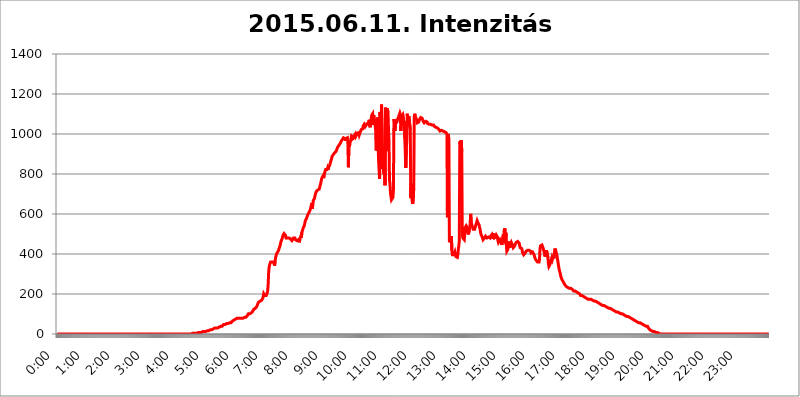
| Category | 2015.06.11. Intenzitás [W/m^2] |
|---|---|
| 0.0 | 0 |
| 0.0006944444444444445 | 0 |
| 0.001388888888888889 | 0 |
| 0.0020833333333333333 | 0 |
| 0.002777777777777778 | 0 |
| 0.003472222222222222 | 0 |
| 0.004166666666666667 | 0 |
| 0.004861111111111111 | 0 |
| 0.005555555555555556 | 0 |
| 0.0062499999999999995 | 0 |
| 0.006944444444444444 | 0 |
| 0.007638888888888889 | 0 |
| 0.008333333333333333 | 0 |
| 0.009027777777777779 | 0 |
| 0.009722222222222222 | 0 |
| 0.010416666666666666 | 0 |
| 0.011111111111111112 | 0 |
| 0.011805555555555555 | 0 |
| 0.012499999999999999 | 0 |
| 0.013194444444444444 | 0 |
| 0.013888888888888888 | 0 |
| 0.014583333333333332 | 0 |
| 0.015277777777777777 | 0 |
| 0.015972222222222224 | 0 |
| 0.016666666666666666 | 0 |
| 0.017361111111111112 | 0 |
| 0.018055555555555557 | 0 |
| 0.01875 | 0 |
| 0.019444444444444445 | 0 |
| 0.02013888888888889 | 0 |
| 0.020833333333333332 | 0 |
| 0.02152777777777778 | 0 |
| 0.022222222222222223 | 0 |
| 0.02291666666666667 | 0 |
| 0.02361111111111111 | 0 |
| 0.024305555555555556 | 0 |
| 0.024999999999999998 | 0 |
| 0.025694444444444447 | 0 |
| 0.02638888888888889 | 0 |
| 0.027083333333333334 | 0 |
| 0.027777777777777776 | 0 |
| 0.02847222222222222 | 0 |
| 0.029166666666666664 | 0 |
| 0.029861111111111113 | 0 |
| 0.030555555555555555 | 0 |
| 0.03125 | 0 |
| 0.03194444444444445 | 0 |
| 0.03263888888888889 | 0 |
| 0.03333333333333333 | 0 |
| 0.034027777777777775 | 0 |
| 0.034722222222222224 | 0 |
| 0.035416666666666666 | 0 |
| 0.036111111111111115 | 0 |
| 0.03680555555555556 | 0 |
| 0.0375 | 0 |
| 0.03819444444444444 | 0 |
| 0.03888888888888889 | 0 |
| 0.03958333333333333 | 0 |
| 0.04027777777777778 | 0 |
| 0.04097222222222222 | 0 |
| 0.041666666666666664 | 0 |
| 0.042361111111111106 | 0 |
| 0.04305555555555556 | 0 |
| 0.043750000000000004 | 0 |
| 0.044444444444444446 | 0 |
| 0.04513888888888889 | 0 |
| 0.04583333333333334 | 0 |
| 0.04652777777777778 | 0 |
| 0.04722222222222222 | 0 |
| 0.04791666666666666 | 0 |
| 0.04861111111111111 | 0 |
| 0.049305555555555554 | 0 |
| 0.049999999999999996 | 0 |
| 0.05069444444444445 | 0 |
| 0.051388888888888894 | 0 |
| 0.052083333333333336 | 0 |
| 0.05277777777777778 | 0 |
| 0.05347222222222222 | 0 |
| 0.05416666666666667 | 0 |
| 0.05486111111111111 | 0 |
| 0.05555555555555555 | 0 |
| 0.05625 | 0 |
| 0.05694444444444444 | 0 |
| 0.057638888888888885 | 0 |
| 0.05833333333333333 | 0 |
| 0.05902777777777778 | 0 |
| 0.059722222222222225 | 0 |
| 0.06041666666666667 | 0 |
| 0.061111111111111116 | 0 |
| 0.06180555555555556 | 0 |
| 0.0625 | 0 |
| 0.06319444444444444 | 0 |
| 0.06388888888888888 | 0 |
| 0.06458333333333334 | 0 |
| 0.06527777777777778 | 0 |
| 0.06597222222222222 | 0 |
| 0.06666666666666667 | 0 |
| 0.06736111111111111 | 0 |
| 0.06805555555555555 | 0 |
| 0.06874999999999999 | 0 |
| 0.06944444444444443 | 0 |
| 0.07013888888888889 | 0 |
| 0.07083333333333333 | 0 |
| 0.07152777777777779 | 0 |
| 0.07222222222222223 | 0 |
| 0.07291666666666667 | 0 |
| 0.07361111111111111 | 0 |
| 0.07430555555555556 | 0 |
| 0.075 | 0 |
| 0.07569444444444444 | 0 |
| 0.0763888888888889 | 0 |
| 0.07708333333333334 | 0 |
| 0.07777777777777778 | 0 |
| 0.07847222222222222 | 0 |
| 0.07916666666666666 | 0 |
| 0.0798611111111111 | 0 |
| 0.08055555555555556 | 0 |
| 0.08125 | 0 |
| 0.08194444444444444 | 0 |
| 0.08263888888888889 | 0 |
| 0.08333333333333333 | 0 |
| 0.08402777777777777 | 0 |
| 0.08472222222222221 | 0 |
| 0.08541666666666665 | 0 |
| 0.08611111111111112 | 0 |
| 0.08680555555555557 | 0 |
| 0.08750000000000001 | 0 |
| 0.08819444444444445 | 0 |
| 0.08888888888888889 | 0 |
| 0.08958333333333333 | 0 |
| 0.09027777777777778 | 0 |
| 0.09097222222222222 | 0 |
| 0.09166666666666667 | 0 |
| 0.09236111111111112 | 0 |
| 0.09305555555555556 | 0 |
| 0.09375 | 0 |
| 0.09444444444444444 | 0 |
| 0.09513888888888888 | 0 |
| 0.09583333333333333 | 0 |
| 0.09652777777777777 | 0 |
| 0.09722222222222222 | 0 |
| 0.09791666666666667 | 0 |
| 0.09861111111111111 | 0 |
| 0.09930555555555555 | 0 |
| 0.09999999999999999 | 0 |
| 0.10069444444444443 | 0 |
| 0.1013888888888889 | 0 |
| 0.10208333333333335 | 0 |
| 0.10277777777777779 | 0 |
| 0.10347222222222223 | 0 |
| 0.10416666666666667 | 0 |
| 0.10486111111111111 | 0 |
| 0.10555555555555556 | 0 |
| 0.10625 | 0 |
| 0.10694444444444444 | 0 |
| 0.1076388888888889 | 0 |
| 0.10833333333333334 | 0 |
| 0.10902777777777778 | 0 |
| 0.10972222222222222 | 0 |
| 0.1111111111111111 | 0 |
| 0.11180555555555556 | 0 |
| 0.11180555555555556 | 0 |
| 0.1125 | 0 |
| 0.11319444444444444 | 0 |
| 0.11388888888888889 | 0 |
| 0.11458333333333333 | 0 |
| 0.11527777777777777 | 0 |
| 0.11597222222222221 | 0 |
| 0.11666666666666665 | 0 |
| 0.1173611111111111 | 0 |
| 0.11805555555555557 | 0 |
| 0.11944444444444445 | 0 |
| 0.12013888888888889 | 0 |
| 0.12083333333333333 | 0 |
| 0.12152777777777778 | 0 |
| 0.12222222222222223 | 0 |
| 0.12291666666666667 | 0 |
| 0.12291666666666667 | 0 |
| 0.12361111111111112 | 0 |
| 0.12430555555555556 | 0 |
| 0.125 | 0 |
| 0.12569444444444444 | 0 |
| 0.12638888888888888 | 0 |
| 0.12708333333333333 | 0 |
| 0.16875 | 0 |
| 0.12847222222222224 | 0 |
| 0.12916666666666668 | 0 |
| 0.12986111111111112 | 0 |
| 0.13055555555555556 | 0 |
| 0.13125 | 0 |
| 0.13194444444444445 | 0 |
| 0.1326388888888889 | 0 |
| 0.13333333333333333 | 0 |
| 0.13402777777777777 | 0 |
| 0.13402777777777777 | 0 |
| 0.13472222222222222 | 0 |
| 0.13541666666666666 | 0 |
| 0.1361111111111111 | 0 |
| 0.13749999999999998 | 0 |
| 0.13819444444444443 | 0 |
| 0.1388888888888889 | 0 |
| 0.13958333333333334 | 0 |
| 0.14027777777777778 | 0 |
| 0.14097222222222222 | 0 |
| 0.14166666666666666 | 0 |
| 0.1423611111111111 | 0 |
| 0.14305555555555557 | 0 |
| 0.14375000000000002 | 0 |
| 0.14444444444444446 | 0 |
| 0.1451388888888889 | 0 |
| 0.1451388888888889 | 0 |
| 0.14652777777777778 | 0 |
| 0.14722222222222223 | 0 |
| 0.14791666666666667 | 0 |
| 0.1486111111111111 | 0 |
| 0.14930555555555555 | 0 |
| 0.15 | 0 |
| 0.15069444444444444 | 0 |
| 0.15138888888888888 | 0 |
| 0.15208333333333332 | 0 |
| 0.15277777777777776 | 0 |
| 0.15347222222222223 | 0 |
| 0.15416666666666667 | 0 |
| 0.15486111111111112 | 0 |
| 0.15555555555555556 | 0 |
| 0.15625 | 0 |
| 0.15694444444444444 | 0 |
| 0.15763888888888888 | 0 |
| 0.15833333333333333 | 0 |
| 0.15902777777777777 | 0 |
| 0.15972222222222224 | 0 |
| 0.16041666666666668 | 0 |
| 0.16111111111111112 | 0 |
| 0.16180555555555556 | 0 |
| 0.1625 | 0 |
| 0.16319444444444445 | 0 |
| 0.1638888888888889 | 0 |
| 0.16458333333333333 | 0 |
| 0.16527777777777777 | 0 |
| 0.16597222222222222 | 0 |
| 0.16666666666666666 | 0 |
| 0.1673611111111111 | 0 |
| 0.16805555555555554 | 0 |
| 0.16874999999999998 | 0 |
| 0.16944444444444443 | 0 |
| 0.17013888888888887 | 0 |
| 0.1708333333333333 | 0 |
| 0.17152777777777775 | 0 |
| 0.17222222222222225 | 0 |
| 0.1729166666666667 | 0 |
| 0.17361111111111113 | 0 |
| 0.17430555555555557 | 0 |
| 0.17500000000000002 | 0 |
| 0.17569444444444446 | 0 |
| 0.1763888888888889 | 0 |
| 0.17708333333333334 | 0 |
| 0.17777777777777778 | 0 |
| 0.17847222222222223 | 0 |
| 0.17916666666666667 | 0 |
| 0.1798611111111111 | 0 |
| 0.18055555555555555 | 0 |
| 0.18125 | 0 |
| 0.18194444444444444 | 0 |
| 0.1826388888888889 | 0 |
| 0.18333333333333335 | 0 |
| 0.1840277777777778 | 0 |
| 0.18472222222222223 | 0 |
| 0.18541666666666667 | 0 |
| 0.18611111111111112 | 0 |
| 0.18680555555555556 | 3.525 |
| 0.1875 | 0 |
| 0.18819444444444444 | 3.525 |
| 0.18888888888888888 | 3.525 |
| 0.18958333333333333 | 3.525 |
| 0.19027777777777777 | 3.525 |
| 0.1909722222222222 | 3.525 |
| 0.19166666666666665 | 3.525 |
| 0.19236111111111112 | 3.525 |
| 0.19305555555555554 | 3.525 |
| 0.19375 | 3.525 |
| 0.19444444444444445 | 3.525 |
| 0.1951388888888889 | 3.525 |
| 0.19583333333333333 | 3.525 |
| 0.19652777777777777 | 3.525 |
| 0.19722222222222222 | 7.887 |
| 0.19791666666666666 | 7.887 |
| 0.1986111111111111 | 7.887 |
| 0.19930555555555554 | 7.887 |
| 0.19999999999999998 | 7.887 |
| 0.20069444444444443 | 7.887 |
| 0.20138888888888887 | 7.887 |
| 0.2020833333333333 | 7.887 |
| 0.2027777777777778 | 12.257 |
| 0.2034722222222222 | 12.257 |
| 0.2041666666666667 | 12.257 |
| 0.20486111111111113 | 12.257 |
| 0.20555555555555557 | 12.257 |
| 0.20625000000000002 | 12.257 |
| 0.20694444444444446 | 12.257 |
| 0.2076388888888889 | 12.257 |
| 0.20833333333333334 | 12.257 |
| 0.20902777777777778 | 16.636 |
| 0.20972222222222223 | 16.636 |
| 0.21041666666666667 | 16.636 |
| 0.2111111111111111 | 16.636 |
| 0.21180555555555555 | 16.636 |
| 0.2125 | 16.636 |
| 0.21319444444444444 | 21.024 |
| 0.2138888888888889 | 21.024 |
| 0.21458333333333335 | 21.024 |
| 0.2152777777777778 | 21.024 |
| 0.21597222222222223 | 21.024 |
| 0.21666666666666667 | 21.024 |
| 0.21736111111111112 | 21.024 |
| 0.21805555555555556 | 25.419 |
| 0.21875 | 25.419 |
| 0.21944444444444444 | 25.419 |
| 0.22013888888888888 | 25.419 |
| 0.22083333333333333 | 29.823 |
| 0.22152777777777777 | 29.823 |
| 0.2222222222222222 | 29.823 |
| 0.22291666666666665 | 29.823 |
| 0.2236111111111111 | 29.823 |
| 0.22430555555555556 | 29.823 |
| 0.225 | 29.823 |
| 0.22569444444444445 | 34.234 |
| 0.2263888888888889 | 34.234 |
| 0.22708333333333333 | 34.234 |
| 0.22777777777777777 | 34.234 |
| 0.22847222222222222 | 38.653 |
| 0.22916666666666666 | 38.653 |
| 0.2298611111111111 | 38.653 |
| 0.23055555555555554 | 38.653 |
| 0.23124999999999998 | 38.653 |
| 0.23194444444444443 | 43.079 |
| 0.23263888888888887 | 43.079 |
| 0.2333333333333333 | 47.511 |
| 0.2340277777777778 | 47.511 |
| 0.2347222222222222 | 47.511 |
| 0.2354166666666667 | 47.511 |
| 0.23611111111111113 | 47.511 |
| 0.23680555555555557 | 47.511 |
| 0.23750000000000002 | 51.951 |
| 0.23819444444444446 | 51.951 |
| 0.2388888888888889 | 51.951 |
| 0.23958333333333334 | 51.951 |
| 0.24027777777777778 | 56.398 |
| 0.24097222222222223 | 56.398 |
| 0.24166666666666667 | 56.398 |
| 0.2423611111111111 | 56.398 |
| 0.24305555555555555 | 56.398 |
| 0.24375 | 56.398 |
| 0.24444444444444446 | 60.85 |
| 0.24513888888888888 | 60.85 |
| 0.24583333333333335 | 65.31 |
| 0.2465277777777778 | 65.31 |
| 0.24722222222222223 | 69.775 |
| 0.24791666666666667 | 69.775 |
| 0.24861111111111112 | 74.246 |
| 0.24930555555555556 | 74.246 |
| 0.25 | 74.246 |
| 0.25069444444444444 | 74.246 |
| 0.2513888888888889 | 78.722 |
| 0.2520833333333333 | 78.722 |
| 0.25277777777777777 | 83.205 |
| 0.2534722222222222 | 78.722 |
| 0.25416666666666665 | 78.722 |
| 0.2548611111111111 | 78.722 |
| 0.2555555555555556 | 78.722 |
| 0.25625000000000003 | 78.722 |
| 0.2569444444444445 | 78.722 |
| 0.2576388888888889 | 78.722 |
| 0.25833333333333336 | 78.722 |
| 0.2590277777777778 | 78.722 |
| 0.25972222222222224 | 78.722 |
| 0.2604166666666667 | 78.722 |
| 0.2611111111111111 | 83.205 |
| 0.26180555555555557 | 83.205 |
| 0.2625 | 83.205 |
| 0.26319444444444445 | 83.205 |
| 0.2638888888888889 | 83.205 |
| 0.26458333333333334 | 83.205 |
| 0.2652777777777778 | 83.205 |
| 0.2659722222222222 | 87.692 |
| 0.26666666666666666 | 92.184 |
| 0.2673611111111111 | 96.682 |
| 0.26805555555555555 | 101.184 |
| 0.26875 | 101.184 |
| 0.26944444444444443 | 101.184 |
| 0.2701388888888889 | 101.184 |
| 0.2708333333333333 | 101.184 |
| 0.27152777777777776 | 101.184 |
| 0.2722222222222222 | 105.69 |
| 0.27291666666666664 | 110.201 |
| 0.2736111111111111 | 110.201 |
| 0.2743055555555555 | 114.716 |
| 0.27499999999999997 | 119.235 |
| 0.27569444444444446 | 123.758 |
| 0.27638888888888885 | 128.284 |
| 0.27708333333333335 | 128.284 |
| 0.2777777777777778 | 128.284 |
| 0.27847222222222223 | 128.284 |
| 0.2791666666666667 | 132.814 |
| 0.2798611111111111 | 137.347 |
| 0.28055555555555556 | 141.884 |
| 0.28125 | 150.964 |
| 0.28194444444444444 | 155.509 |
| 0.2826388888888889 | 160.056 |
| 0.2833333333333333 | 160.056 |
| 0.28402777777777777 | 164.605 |
| 0.2847222222222222 | 164.605 |
| 0.28541666666666665 | 164.605 |
| 0.28611111111111115 | 169.156 |
| 0.28680555555555554 | 169.156 |
| 0.28750000000000003 | 173.709 |
| 0.2881944444444445 | 178.264 |
| 0.2888888888888889 | 187.378 |
| 0.28958333333333336 | 201.058 |
| 0.2902777777777778 | 201.058 |
| 0.29097222222222224 | 191.937 |
| 0.2916666666666667 | 187.378 |
| 0.2923611111111111 | 187.378 |
| 0.29305555555555557 | 191.937 |
| 0.29375 | 196.497 |
| 0.29444444444444445 | 205.62 |
| 0.2951388888888889 | 214.746 |
| 0.29583333333333334 | 251.251 |
| 0.2965277777777778 | 310.44 |
| 0.2972222222222222 | 333.113 |
| 0.29791666666666666 | 346.682 |
| 0.2986111111111111 | 351.198 |
| 0.29930555555555555 | 360.221 |
| 0.3 | 355.712 |
| 0.30069444444444443 | 355.712 |
| 0.3013888888888889 | 360.221 |
| 0.3020833333333333 | 360.221 |
| 0.30277777777777776 | 360.221 |
| 0.3034722222222222 | 360.221 |
| 0.30416666666666664 | 360.221 |
| 0.3048611111111111 | 342.162 |
| 0.3055555555555555 | 364.728 |
| 0.30624999999999997 | 382.715 |
| 0.3069444444444444 | 391.685 |
| 0.3076388888888889 | 400.638 |
| 0.30833333333333335 | 405.108 |
| 0.3090277777777778 | 409.574 |
| 0.30972222222222223 | 414.035 |
| 0.3104166666666667 | 418.492 |
| 0.3111111111111111 | 427.39 |
| 0.31180555555555556 | 431.833 |
| 0.3125 | 440.702 |
| 0.31319444444444444 | 453.968 |
| 0.3138888888888889 | 462.786 |
| 0.3145833333333333 | 467.187 |
| 0.31527777777777777 | 475.972 |
| 0.3159722222222222 | 484.735 |
| 0.31666666666666665 | 493.475 |
| 0.31736111111111115 | 497.836 |
| 0.31805555555555554 | 502.192 |
| 0.31875000000000003 | 502.192 |
| 0.3194444444444445 | 502.192 |
| 0.3201388888888889 | 493.475 |
| 0.32083333333333336 | 480.356 |
| 0.3215277777777778 | 475.972 |
| 0.32222222222222224 | 475.972 |
| 0.3229166666666667 | 480.356 |
| 0.3236111111111111 | 480.356 |
| 0.32430555555555557 | 484.735 |
| 0.325 | 480.356 |
| 0.32569444444444445 | 480.356 |
| 0.3263888888888889 | 480.356 |
| 0.32708333333333334 | 475.972 |
| 0.3277777777777778 | 471.582 |
| 0.3284722222222222 | 471.582 |
| 0.32916666666666666 | 467.187 |
| 0.3298611111111111 | 467.187 |
| 0.33055555555555555 | 471.582 |
| 0.33125 | 480.356 |
| 0.33194444444444443 | 480.356 |
| 0.3326388888888889 | 484.735 |
| 0.3333333333333333 | 480.356 |
| 0.3340277777777778 | 471.582 |
| 0.3347222222222222 | 467.187 |
| 0.3354166666666667 | 467.187 |
| 0.3361111111111111 | 467.187 |
| 0.3368055555555556 | 462.786 |
| 0.33749999999999997 | 471.582 |
| 0.33819444444444446 | 471.582 |
| 0.33888888888888885 | 471.582 |
| 0.33958333333333335 | 458.38 |
| 0.34027777777777773 | 475.972 |
| 0.34097222222222223 | 475.972 |
| 0.3416666666666666 | 489.108 |
| 0.3423611111111111 | 480.356 |
| 0.3430555555555555 | 506.542 |
| 0.34375 | 515.223 |
| 0.3444444444444445 | 519.555 |
| 0.3451388888888889 | 532.513 |
| 0.3458333333333334 | 536.82 |
| 0.34652777777777777 | 541.121 |
| 0.34722222222222227 | 553.986 |
| 0.34791666666666665 | 566.793 |
| 0.34861111111111115 | 571.049 |
| 0.34930555555555554 | 575.299 |
| 0.35000000000000003 | 575.299 |
| 0.3506944444444444 | 575.299 |
| 0.3513888888888889 | 596.45 |
| 0.3520833333333333 | 592.233 |
| 0.3527777777777778 | 604.864 |
| 0.3534722222222222 | 600.661 |
| 0.3541666666666667 | 609.062 |
| 0.3548611111111111 | 621.613 |
| 0.35555555555555557 | 625.784 |
| 0.35625 | 642.4 |
| 0.35694444444444445 | 654.791 |
| 0.3576388888888889 | 625.784 |
| 0.35833333333333334 | 642.4 |
| 0.3590277777777778 | 667.123 |
| 0.3597222222222222 | 671.22 |
| 0.36041666666666666 | 675.311 |
| 0.3611111111111111 | 683.473 |
| 0.36180555555555555 | 695.666 |
| 0.3625 | 703.762 |
| 0.36319444444444443 | 711.832 |
| 0.3638888888888889 | 711.832 |
| 0.3645833333333333 | 715.858 |
| 0.3652777777777778 | 719.877 |
| 0.3659722222222222 | 723.889 |
| 0.3666666666666667 | 719.877 |
| 0.3673611111111111 | 723.889 |
| 0.3680555555555556 | 731.896 |
| 0.36874999999999997 | 743.859 |
| 0.36944444444444446 | 751.803 |
| 0.37013888888888885 | 763.674 |
| 0.37083333333333335 | 775.492 |
| 0.37152777777777773 | 783.342 |
| 0.37222222222222223 | 787.258 |
| 0.3729166666666666 | 791.169 |
| 0.3736111111111111 | 779.42 |
| 0.3743055555555555 | 795.074 |
| 0.375 | 798.974 |
| 0.3756944444444445 | 814.519 |
| 0.3763888888888889 | 822.26 |
| 0.3770833333333334 | 822.26 |
| 0.37777777777777777 | 826.123 |
| 0.37847222222222227 | 822.26 |
| 0.37916666666666665 | 829.981 |
| 0.37986111111111115 | 822.26 |
| 0.38055555555555554 | 833.834 |
| 0.38125000000000003 | 833.834 |
| 0.3819444444444444 | 841.526 |
| 0.3826388888888889 | 841.526 |
| 0.3833333333333333 | 860.676 |
| 0.3840277777777778 | 864.493 |
| 0.3847222222222222 | 875.918 |
| 0.3854166666666667 | 887.309 |
| 0.3861111111111111 | 887.309 |
| 0.38680555555555557 | 894.885 |
| 0.3875 | 894.885 |
| 0.38819444444444445 | 902.447 |
| 0.3888888888888889 | 902.447 |
| 0.38958333333333334 | 902.447 |
| 0.3902777777777778 | 909.996 |
| 0.3909722222222222 | 913.766 |
| 0.39166666666666666 | 917.534 |
| 0.3923611111111111 | 925.06 |
| 0.39305555555555555 | 932.576 |
| 0.39375 | 936.33 |
| 0.39444444444444443 | 940.082 |
| 0.3951388888888889 | 943.832 |
| 0.3958333333333333 | 947.58 |
| 0.3965277777777778 | 951.327 |
| 0.3972222222222222 | 955.071 |
| 0.3979166666666667 | 962.555 |
| 0.3986111111111111 | 962.555 |
| 0.3993055555555556 | 962.555 |
| 0.39999999999999997 | 973.772 |
| 0.40069444444444446 | 973.772 |
| 0.40138888888888885 | 981.244 |
| 0.40208333333333335 | 977.508 |
| 0.40277777777777773 | 981.244 |
| 0.40347222222222223 | 977.508 |
| 0.4041666666666666 | 966.295 |
| 0.4048611111111111 | 977.508 |
| 0.4055555555555555 | 973.772 |
| 0.40625 | 973.772 |
| 0.4069444444444445 | 981.244 |
| 0.4076388888888889 | 951.327 |
| 0.4083333333333334 | 833.834 |
| 0.40902777777777777 | 951.327 |
| 0.40972222222222227 | 936.33 |
| 0.41041666666666665 | 951.327 |
| 0.41111111111111115 | 962.555 |
| 0.41180555555555554 | 973.772 |
| 0.41250000000000003 | 966.295 |
| 0.4131944444444444 | 988.714 |
| 0.4138888888888889 | 992.448 |
| 0.4145833333333333 | 984.98 |
| 0.4152777777777778 | 981.244 |
| 0.4159722222222222 | 988.714 |
| 0.4166666666666667 | 984.98 |
| 0.4173611111111111 | 992.448 |
| 0.41805555555555557 | 999.916 |
| 0.41875 | 988.714 |
| 0.41944444444444445 | 988.714 |
| 0.4201388888888889 | 988.714 |
| 0.42083333333333334 | 1003.65 |
| 0.4215277777777778 | 1007.383 |
| 0.4222222222222222 | 1003.65 |
| 0.42291666666666666 | 1007.383 |
| 0.4236111111111111 | 996.182 |
| 0.42430555555555555 | 1003.65 |
| 0.425 | 1007.383 |
| 0.42569444444444443 | 1007.383 |
| 0.4263888888888889 | 1022.323 |
| 0.4270833333333333 | 1018.587 |
| 0.4277777777777778 | 1022.323 |
| 0.4284722222222222 | 1026.06 |
| 0.4291666666666667 | 1041.019 |
| 0.4298611111111111 | 1044.762 |
| 0.4305555555555556 | 1048.508 |
| 0.43124999999999997 | 1044.762 |
| 0.43194444444444446 | 1037.277 |
| 0.43263888888888885 | 1037.277 |
| 0.43333333333333335 | 1044.762 |
| 0.43402777777777773 | 1041.019 |
| 0.43472222222222223 | 1052.255 |
| 0.4354166666666666 | 1048.508 |
| 0.4361111111111111 | 1056.004 |
| 0.4368055555555555 | 1056.004 |
| 0.4375 | 1071.027 |
| 0.4381944444444445 | 1041.019 |
| 0.4388888888888889 | 1033.537 |
| 0.4395833333333334 | 1059.756 |
| 0.44027777777777777 | 1074.789 |
| 0.44097222222222227 | 1093.653 |
| 0.44166666666666665 | 1097.437 |
| 0.44236111111111115 | 1101.226 |
| 0.44305555555555554 | 1044.762 |
| 0.44375000000000003 | 1093.653 |
| 0.4444444444444444 | 1086.097 |
| 0.4451388888888889 | 1089.873 |
| 0.4458333333333333 | 1082.324 |
| 0.4465277777777778 | 1022.323 |
| 0.4472222222222222 | 917.534 |
| 0.4479166666666667 | 925.06 |
| 0.4486111111111111 | 970.034 |
| 0.44930555555555557 | 1082.324 |
| 0.45 | 947.58 |
| 0.45069444444444445 | 868.305 |
| 0.4513888888888889 | 868.305 |
| 0.45208333333333334 | 775.492 |
| 0.4527777777777778 | 1108.816 |
| 0.4534722222222222 | 996.182 |
| 0.45416666666666666 | 1063.51 |
| 0.4548611111111111 | 1147.086 |
| 0.45555555555555555 | 1147.086 |
| 0.45625 | 826.123 |
| 0.45694444444444443 | 936.33 |
| 0.4576388888888889 | 814.519 |
| 0.4583333333333333 | 798.974 |
| 0.4590277777777778 | 853.029 |
| 0.4597222222222222 | 743.859 |
| 0.4604166666666667 | 1131.708 |
| 0.4611111111111111 | 1135.543 |
| 0.4618055555555556 | 917.534 |
| 0.46249999999999997 | 1127.879 |
| 0.46319444444444446 | 1127.879 |
| 0.46388888888888885 | 1108.816 |
| 0.46458333333333335 | 1022.323 |
| 0.46527777777777773 | 962.555 |
| 0.46597222222222223 | 771.559 |
| 0.4666666666666666 | 751.803 |
| 0.4673611111111111 | 703.762 |
| 0.4680555555555555 | 687.544 |
| 0.46875 | 671.22 |
| 0.4694444444444445 | 667.123 |
| 0.4701388888888889 | 671.22 |
| 0.4708333333333334 | 683.473 |
| 0.47152777777777777 | 723.889 |
| 0.47222222222222227 | 1074.789 |
| 0.47291666666666665 | 1059.756 |
| 0.47361111111111115 | 1014.852 |
| 0.47430555555555554 | 1052.255 |
| 0.47500000000000003 | 1052.255 |
| 0.4756944444444444 | 1052.255 |
| 0.4763888888888889 | 1059.756 |
| 0.4770833333333333 | 1071.027 |
| 0.4777777777777778 | 1074.789 |
| 0.4784722222222222 | 1074.789 |
| 0.4791666666666667 | 1089.873 |
| 0.4798611111111111 | 1097.437 |
| 0.48055555555555557 | 1105.019 |
| 0.48125 | 1097.437 |
| 0.48194444444444445 | 1014.852 |
| 0.4826388888888889 | 1059.756 |
| 0.48333333333333334 | 1089.873 |
| 0.4840277777777778 | 1093.653 |
| 0.4847222222222222 | 1097.437 |
| 0.48541666666666666 | 1086.097 |
| 0.4861111111111111 | 1052.255 |
| 0.48680555555555555 | 1063.51 |
| 0.4875 | 977.508 |
| 0.48819444444444443 | 973.772 |
| 0.4888888888888889 | 829.981 |
| 0.4895833333333333 | 925.06 |
| 0.4902777777777778 | 966.295 |
| 0.4909722222222222 | 1101.226 |
| 0.4916666666666667 | 1037.277 |
| 0.4923611111111111 | 1067.267 |
| 0.4930555555555556 | 1089.873 |
| 0.49374999999999997 | 1093.653 |
| 0.49444444444444446 | 1086.097 |
| 0.49513888888888885 | 1022.323 |
| 0.49583333333333335 | 679.395 |
| 0.49652777777777773 | 751.803 |
| 0.49722222222222223 | 751.803 |
| 0.4979166666666666 | 663.019 |
| 0.4986111111111111 | 650.667 |
| 0.4993055555555555 | 654.791 |
| 0.5 | 727.896 |
| 0.5006944444444444 | 1086.097 |
| 0.5013888888888889 | 1101.226 |
| 0.5020833333333333 | 1089.873 |
| 0.5027777777777778 | 1082.324 |
| 0.5034722222222222 | 1082.324 |
| 0.5041666666666667 | 1071.027 |
| 0.5048611111111111 | 1056.004 |
| 0.5055555555555555 | 1059.756 |
| 0.50625 | 1059.756 |
| 0.5069444444444444 | 1059.756 |
| 0.5076388888888889 | 1067.267 |
| 0.5083333333333333 | 1074.789 |
| 0.5090277777777777 | 1074.789 |
| 0.5097222222222222 | 1082.324 |
| 0.5104166666666666 | 1082.324 |
| 0.5111111111111112 | 1086.097 |
| 0.5118055555555555 | 1078.555 |
| 0.5125000000000001 | 1071.027 |
| 0.5131944444444444 | 1063.51 |
| 0.513888888888889 | 1059.756 |
| 0.5145833333333333 | 1056.004 |
| 0.5152777777777778 | 1059.756 |
| 0.5159722222222222 | 1059.756 |
| 0.5166666666666667 | 1063.51 |
| 0.517361111111111 | 1063.51 |
| 0.5180555555555556 | 1059.756 |
| 0.5187499999999999 | 1059.756 |
| 0.5194444444444445 | 1052.255 |
| 0.5201388888888888 | 1048.508 |
| 0.5208333333333334 | 1048.508 |
| 0.5215277777777778 | 1048.508 |
| 0.5222222222222223 | 1048.508 |
| 0.5229166666666667 | 1048.508 |
| 0.5236111111111111 | 1048.508 |
| 0.5243055555555556 | 1048.508 |
| 0.525 | 1044.762 |
| 0.5256944444444445 | 1044.762 |
| 0.5263888888888889 | 1044.762 |
| 0.5270833333333333 | 1044.762 |
| 0.5277777777777778 | 1044.762 |
| 0.5284722222222222 | 1041.019 |
| 0.5291666666666667 | 1037.277 |
| 0.5298611111111111 | 1037.277 |
| 0.5305555555555556 | 1033.537 |
| 0.53125 | 1033.537 |
| 0.5319444444444444 | 1029.798 |
| 0.5326388888888889 | 1029.798 |
| 0.5333333333333333 | 1029.798 |
| 0.5340277777777778 | 1029.798 |
| 0.5347222222222222 | 1026.06 |
| 0.5354166666666667 | 1022.323 |
| 0.5361111111111111 | 1018.587 |
| 0.5368055555555555 | 1014.852 |
| 0.5375 | 1018.587 |
| 0.5381944444444444 | 1018.587 |
| 0.5388888888888889 | 1018.587 |
| 0.5395833333333333 | 1018.587 |
| 0.5402777777777777 | 1014.852 |
| 0.5409722222222222 | 1014.852 |
| 0.5416666666666666 | 1014.852 |
| 0.5423611111111112 | 1014.852 |
| 0.5430555555555555 | 1011.118 |
| 0.5437500000000001 | 1007.383 |
| 0.5444444444444444 | 1007.383 |
| 0.545138888888889 | 1007.383 |
| 0.5458333333333333 | 1007.383 |
| 0.5465277777777778 | 999.916 |
| 0.5472222222222222 | 583.779 |
| 0.5479166666666667 | 999.916 |
| 0.548611111111111 | 999.916 |
| 0.5493055555555556 | 973.772 |
| 0.5499999999999999 | 458.38 |
| 0.5506944444444445 | 462.786 |
| 0.5513888888888888 | 475.972 |
| 0.5520833333333334 | 475.972 |
| 0.5527777777777778 | 489.108 |
| 0.5534722222222223 | 418.492 |
| 0.5541666666666667 | 396.164 |
| 0.5548611111111111 | 391.685 |
| 0.5555555555555556 | 396.164 |
| 0.55625 | 396.164 |
| 0.5569444444444445 | 400.638 |
| 0.5576388888888889 | 409.574 |
| 0.5583333333333333 | 396.164 |
| 0.5590277777777778 | 387.202 |
| 0.5597222222222222 | 387.202 |
| 0.5604166666666667 | 382.715 |
| 0.5611111111111111 | 382.715 |
| 0.5618055555555556 | 396.164 |
| 0.5625 | 422.943 |
| 0.5631944444444444 | 440.702 |
| 0.5638888888888889 | 467.187 |
| 0.5645833333333333 | 962.555 |
| 0.5652777777777778 | 951.327 |
| 0.5659722222222222 | 943.832 |
| 0.5666666666666667 | 970.034 |
| 0.5673611111111111 | 909.996 |
| 0.5680555555555555 | 506.542 |
| 0.56875 | 480.356 |
| 0.5694444444444444 | 475.972 |
| 0.5701388888888889 | 475.972 |
| 0.5708333333333333 | 471.582 |
| 0.5715277777777777 | 475.972 |
| 0.5722222222222222 | 532.513 |
| 0.5729166666666666 | 528.2 |
| 0.5736111111111112 | 541.121 |
| 0.5743055555555555 | 536.82 |
| 0.5750000000000001 | 532.513 |
| 0.5756944444444444 | 515.223 |
| 0.576388888888889 | 497.836 |
| 0.5770833333333333 | 502.192 |
| 0.5777777777777778 | 515.223 |
| 0.5784722222222222 | 528.2 |
| 0.5791666666666667 | 553.986 |
| 0.579861111111111 | 600.661 |
| 0.5805555555555556 | 558.261 |
| 0.5812499999999999 | 549.704 |
| 0.5819444444444445 | 541.121 |
| 0.5826388888888888 | 536.82 |
| 0.5833333333333334 | 523.88 |
| 0.5840277777777778 | 523.88 |
| 0.5847222222222223 | 523.88 |
| 0.5854166666666667 | 523.88 |
| 0.5861111111111111 | 532.513 |
| 0.5868055555555556 | 541.121 |
| 0.5875 | 549.704 |
| 0.5881944444444445 | 558.261 |
| 0.5888888888888889 | 566.793 |
| 0.5895833333333333 | 566.793 |
| 0.5902777777777778 | 553.986 |
| 0.5909722222222222 | 558.261 |
| 0.5916666666666667 | 545.416 |
| 0.5923611111111111 | 532.513 |
| 0.5930555555555556 | 523.88 |
| 0.59375 | 506.542 |
| 0.5944444444444444 | 497.836 |
| 0.5951388888888889 | 497.836 |
| 0.5958333333333333 | 493.475 |
| 0.5965277777777778 | 480.356 |
| 0.5972222222222222 | 471.582 |
| 0.5979166666666667 | 467.187 |
| 0.5986111111111111 | 475.972 |
| 0.5993055555555555 | 480.356 |
| 0.6 | 484.735 |
| 0.6006944444444444 | 489.108 |
| 0.6013888888888889 | 489.108 |
| 0.6020833333333333 | 484.735 |
| 0.6027777777777777 | 480.356 |
| 0.6034722222222222 | 480.356 |
| 0.6041666666666666 | 480.356 |
| 0.6048611111111112 | 484.735 |
| 0.6055555555555555 | 480.356 |
| 0.6062500000000001 | 480.356 |
| 0.6069444444444444 | 480.356 |
| 0.607638888888889 | 489.108 |
| 0.6083333333333333 | 484.735 |
| 0.6090277777777778 | 489.108 |
| 0.6097222222222222 | 497.836 |
| 0.6104166666666667 | 497.836 |
| 0.611111111111111 | 475.972 |
| 0.6118055555555556 | 471.582 |
| 0.6124999999999999 | 502.192 |
| 0.6131944444444445 | 480.356 |
| 0.6138888888888888 | 480.356 |
| 0.6145833333333334 | 480.356 |
| 0.6152777777777778 | 484.735 |
| 0.6159722222222223 | 493.475 |
| 0.6166666666666667 | 497.836 |
| 0.6173611111111111 | 484.735 |
| 0.6180555555555556 | 467.187 |
| 0.61875 | 458.38 |
| 0.6194444444444445 | 453.968 |
| 0.6201388888888889 | 458.38 |
| 0.6208333333333333 | 471.582 |
| 0.6215277777777778 | 471.582 |
| 0.6222222222222222 | 467.187 |
| 0.6229166666666667 | 453.968 |
| 0.6236111111111111 | 445.129 |
| 0.6243055555555556 | 440.702 |
| 0.625 | 440.702 |
| 0.6256944444444444 | 497.836 |
| 0.6263888888888889 | 471.582 |
| 0.6270833333333333 | 519.555 |
| 0.6277777777777778 | 528.2 |
| 0.6284722222222222 | 453.968 |
| 0.6291666666666667 | 506.542 |
| 0.6298611111111111 | 445.129 |
| 0.6305555555555555 | 414.035 |
| 0.63125 | 409.574 |
| 0.6319444444444444 | 422.943 |
| 0.6326388888888889 | 422.943 |
| 0.6333333333333333 | 427.39 |
| 0.6340277777777777 | 462.786 |
| 0.6347222222222222 | 431.833 |
| 0.6354166666666666 | 445.129 |
| 0.6361111111111112 | 449.551 |
| 0.6368055555555555 | 458.38 |
| 0.6375000000000001 | 458.38 |
| 0.6381944444444444 | 453.968 |
| 0.638888888888889 | 440.702 |
| 0.6395833333333333 | 431.833 |
| 0.6402777777777778 | 431.833 |
| 0.6409722222222222 | 431.833 |
| 0.6416666666666667 | 440.702 |
| 0.642361111111111 | 449.551 |
| 0.6430555555555556 | 453.968 |
| 0.6437499999999999 | 458.38 |
| 0.6444444444444445 | 462.786 |
| 0.6451388888888888 | 462.786 |
| 0.6458333333333334 | 462.786 |
| 0.6465277777777778 | 462.786 |
| 0.6472222222222223 | 458.38 |
| 0.6479166666666667 | 453.968 |
| 0.6486111111111111 | 440.702 |
| 0.6493055555555556 | 431.833 |
| 0.65 | 427.39 |
| 0.6506944444444445 | 427.39 |
| 0.6513888888888889 | 427.39 |
| 0.6520833333333333 | 418.492 |
| 0.6527777777777778 | 405.108 |
| 0.6534722222222222 | 400.638 |
| 0.6541666666666667 | 396.164 |
| 0.6548611111111111 | 396.164 |
| 0.6555555555555556 | 400.638 |
| 0.65625 | 405.108 |
| 0.6569444444444444 | 409.574 |
| 0.6576388888888889 | 414.035 |
| 0.6583333333333333 | 409.574 |
| 0.6590277777777778 | 414.035 |
| 0.6597222222222222 | 418.492 |
| 0.6604166666666667 | 422.943 |
| 0.6611111111111111 | 418.492 |
| 0.6618055555555555 | 418.492 |
| 0.6625 | 418.492 |
| 0.6631944444444444 | 422.943 |
| 0.6638888888888889 | 414.035 |
| 0.6645833333333333 | 405.108 |
| 0.6652777777777777 | 409.574 |
| 0.6659722222222222 | 409.574 |
| 0.6666666666666666 | 409.574 |
| 0.6673611111111111 | 405.108 |
| 0.6680555555555556 | 405.108 |
| 0.6687500000000001 | 396.164 |
| 0.6694444444444444 | 387.202 |
| 0.6701388888888888 | 378.224 |
| 0.6708333333333334 | 373.729 |
| 0.6715277777777778 | 369.23 |
| 0.6722222222222222 | 364.728 |
| 0.6729166666666666 | 364.728 |
| 0.6736111111111112 | 360.221 |
| 0.6743055555555556 | 355.712 |
| 0.6749999999999999 | 355.712 |
| 0.6756944444444444 | 360.221 |
| 0.6763888888888889 | 373.729 |
| 0.6770833333333334 | 427.39 |
| 0.6777777777777777 | 440.702 |
| 0.6784722222222223 | 440.702 |
| 0.6791666666666667 | 445.129 |
| 0.6798611111111111 | 445.129 |
| 0.6805555555555555 | 445.129 |
| 0.68125 | 431.833 |
| 0.6819444444444445 | 436.27 |
| 0.6826388888888889 | 431.833 |
| 0.6833333333333332 | 405.108 |
| 0.6840277777777778 | 387.202 |
| 0.6847222222222222 | 400.638 |
| 0.6854166666666667 | 409.574 |
| 0.686111111111111 | 418.492 |
| 0.6868055555555556 | 418.492 |
| 0.6875 | 414.035 |
| 0.6881944444444444 | 382.715 |
| 0.688888888888889 | 351.198 |
| 0.6895833333333333 | 337.639 |
| 0.6902777777777778 | 342.162 |
| 0.6909722222222222 | 346.682 |
| 0.6916666666666668 | 351.198 |
| 0.6923611111111111 | 364.728 |
| 0.6930555555555555 | 364.728 |
| 0.69375 | 382.715 |
| 0.6944444444444445 | 373.729 |
| 0.6951388888888889 | 378.224 |
| 0.6958333333333333 | 391.685 |
| 0.6965277777777777 | 378.224 |
| 0.6972222222222223 | 400.638 |
| 0.6979166666666666 | 427.39 |
| 0.6986111111111111 | 422.943 |
| 0.6993055555555556 | 414.035 |
| 0.7000000000000001 | 405.108 |
| 0.7006944444444444 | 396.164 |
| 0.7013888888888888 | 378.224 |
| 0.7020833333333334 | 364.728 |
| 0.7027777777777778 | 346.682 |
| 0.7034722222222222 | 333.113 |
| 0.7041666666666666 | 319.517 |
| 0.7048611111111112 | 310.44 |
| 0.7055555555555556 | 301.354 |
| 0.7062499999999999 | 287.709 |
| 0.7069444444444444 | 283.156 |
| 0.7076388888888889 | 274.047 |
| 0.7083333333333334 | 269.49 |
| 0.7090277777777777 | 264.932 |
| 0.7097222222222223 | 260.373 |
| 0.7104166666666667 | 255.813 |
| 0.7111111111111111 | 251.251 |
| 0.7118055555555555 | 246.689 |
| 0.7125 | 242.127 |
| 0.7131944444444445 | 242.127 |
| 0.7138888888888889 | 237.564 |
| 0.7145833333333332 | 237.564 |
| 0.7152777777777778 | 237.564 |
| 0.7159722222222222 | 233 |
| 0.7166666666666667 | 233 |
| 0.717361111111111 | 233 |
| 0.7180555555555556 | 228.436 |
| 0.71875 | 228.436 |
| 0.7194444444444444 | 228.436 |
| 0.720138888888889 | 228.436 |
| 0.7208333333333333 | 228.436 |
| 0.7215277777777778 | 223.873 |
| 0.7222222222222222 | 223.873 |
| 0.7229166666666668 | 219.309 |
| 0.7236111111111111 | 219.309 |
| 0.7243055555555555 | 214.746 |
| 0.725 | 214.746 |
| 0.7256944444444445 | 214.746 |
| 0.7263888888888889 | 214.746 |
| 0.7270833333333333 | 210.182 |
| 0.7277777777777777 | 210.182 |
| 0.7284722222222223 | 210.182 |
| 0.7291666666666666 | 205.62 |
| 0.7298611111111111 | 205.62 |
| 0.7305555555555556 | 205.62 |
| 0.7312500000000001 | 201.058 |
| 0.7319444444444444 | 201.058 |
| 0.7326388888888888 | 201.058 |
| 0.7333333333333334 | 196.497 |
| 0.7340277777777778 | 191.937 |
| 0.7347222222222222 | 191.937 |
| 0.7354166666666666 | 191.937 |
| 0.7361111111111112 | 191.937 |
| 0.7368055555555556 | 191.937 |
| 0.7374999999999999 | 191.937 |
| 0.7381944444444444 | 187.378 |
| 0.7388888888888889 | 187.378 |
| 0.7395833333333334 | 182.82 |
| 0.7402777777777777 | 182.82 |
| 0.7409722222222223 | 182.82 |
| 0.7416666666666667 | 182.82 |
| 0.7423611111111111 | 178.264 |
| 0.7430555555555555 | 178.264 |
| 0.74375 | 178.264 |
| 0.7444444444444445 | 173.709 |
| 0.7451388888888889 | 173.709 |
| 0.7458333333333332 | 173.709 |
| 0.7465277777777778 | 173.709 |
| 0.7472222222222222 | 173.709 |
| 0.7479166666666667 | 173.709 |
| 0.748611111111111 | 173.709 |
| 0.7493055555555556 | 169.156 |
| 0.75 | 169.156 |
| 0.7506944444444444 | 169.156 |
| 0.751388888888889 | 169.156 |
| 0.7520833333333333 | 164.605 |
| 0.7527777777777778 | 164.605 |
| 0.7534722222222222 | 164.605 |
| 0.7541666666666668 | 164.605 |
| 0.7548611111111111 | 164.605 |
| 0.7555555555555555 | 160.056 |
| 0.75625 | 160.056 |
| 0.7569444444444445 | 160.056 |
| 0.7576388888888889 | 155.509 |
| 0.7583333333333333 | 155.509 |
| 0.7590277777777777 | 155.509 |
| 0.7597222222222223 | 150.964 |
| 0.7604166666666666 | 150.964 |
| 0.7611111111111111 | 150.964 |
| 0.7618055555555556 | 150.964 |
| 0.7625000000000001 | 146.423 |
| 0.7631944444444444 | 146.423 |
| 0.7638888888888888 | 146.423 |
| 0.7645833333333334 | 141.884 |
| 0.7652777777777778 | 141.884 |
| 0.7659722222222222 | 141.884 |
| 0.7666666666666666 | 141.884 |
| 0.7673611111111112 | 141.884 |
| 0.7680555555555556 | 137.347 |
| 0.7687499999999999 | 137.347 |
| 0.7694444444444444 | 137.347 |
| 0.7701388888888889 | 137.347 |
| 0.7708333333333334 | 132.814 |
| 0.7715277777777777 | 132.814 |
| 0.7722222222222223 | 132.814 |
| 0.7729166666666667 | 132.814 |
| 0.7736111111111111 | 128.284 |
| 0.7743055555555555 | 128.284 |
| 0.775 | 128.284 |
| 0.7756944444444445 | 128.284 |
| 0.7763888888888889 | 128.284 |
| 0.7770833333333332 | 123.758 |
| 0.7777777777777778 | 123.758 |
| 0.7784722222222222 | 119.235 |
| 0.7791666666666667 | 119.235 |
| 0.779861111111111 | 119.235 |
| 0.7805555555555556 | 119.235 |
| 0.78125 | 114.716 |
| 0.7819444444444444 | 114.716 |
| 0.782638888888889 | 114.716 |
| 0.7833333333333333 | 114.716 |
| 0.7840277777777778 | 110.201 |
| 0.7847222222222222 | 110.201 |
| 0.7854166666666668 | 110.201 |
| 0.7861111111111111 | 110.201 |
| 0.7868055555555555 | 110.201 |
| 0.7875 | 105.69 |
| 0.7881944444444445 | 105.69 |
| 0.7888888888888889 | 105.69 |
| 0.7895833333333333 | 101.184 |
| 0.7902777777777777 | 101.184 |
| 0.7909722222222223 | 101.184 |
| 0.7916666666666666 | 101.184 |
| 0.7923611111111111 | 101.184 |
| 0.7930555555555556 | 101.184 |
| 0.7937500000000001 | 96.682 |
| 0.7944444444444444 | 96.682 |
| 0.7951388888888888 | 92.184 |
| 0.7958333333333334 | 92.184 |
| 0.7965277777777778 | 92.184 |
| 0.7972222222222222 | 92.184 |
| 0.7979166666666666 | 92.184 |
| 0.7986111111111112 | 87.692 |
| 0.7993055555555556 | 87.692 |
| 0.7999999999999999 | 87.692 |
| 0.8006944444444444 | 87.692 |
| 0.8013888888888889 | 83.205 |
| 0.8020833333333334 | 83.205 |
| 0.8027777777777777 | 83.205 |
| 0.8034722222222223 | 83.205 |
| 0.8041666666666667 | 83.205 |
| 0.8048611111111111 | 78.722 |
| 0.8055555555555555 | 78.722 |
| 0.80625 | 74.246 |
| 0.8069444444444445 | 74.246 |
| 0.8076388888888889 | 74.246 |
| 0.8083333333333332 | 69.775 |
| 0.8090277777777778 | 69.775 |
| 0.8097222222222222 | 65.31 |
| 0.8104166666666667 | 65.31 |
| 0.811111111111111 | 65.31 |
| 0.8118055555555556 | 65.31 |
| 0.8125 | 65.31 |
| 0.8131944444444444 | 60.85 |
| 0.813888888888889 | 60.85 |
| 0.8145833333333333 | 60.85 |
| 0.8152777777777778 | 56.398 |
| 0.8159722222222222 | 56.398 |
| 0.8166666666666668 | 56.398 |
| 0.8173611111111111 | 56.398 |
| 0.8180555555555555 | 51.951 |
| 0.81875 | 51.951 |
| 0.8194444444444445 | 51.951 |
| 0.8201388888888889 | 51.951 |
| 0.8208333333333333 | 47.511 |
| 0.8215277777777777 | 47.511 |
| 0.8222222222222223 | 47.511 |
| 0.8229166666666666 | 47.511 |
| 0.8236111111111111 | 43.079 |
| 0.8243055555555556 | 43.079 |
| 0.8250000000000001 | 43.079 |
| 0.8256944444444444 | 38.653 |
| 0.8263888888888888 | 38.653 |
| 0.8270833333333334 | 38.653 |
| 0.8277777777777778 | 38.653 |
| 0.8284722222222222 | 34.234 |
| 0.8291666666666666 | 29.823 |
| 0.8298611111111112 | 29.823 |
| 0.8305555555555556 | 25.419 |
| 0.8312499999999999 | 21.024 |
| 0.8319444444444444 | 21.024 |
| 0.8326388888888889 | 21.024 |
| 0.8333333333333334 | 16.636 |
| 0.8340277777777777 | 16.636 |
| 0.8347222222222223 | 16.636 |
| 0.8354166666666667 | 12.257 |
| 0.8361111111111111 | 12.257 |
| 0.8368055555555555 | 12.257 |
| 0.8375 | 12.257 |
| 0.8381944444444445 | 12.257 |
| 0.8388888888888889 | 7.887 |
| 0.8395833333333332 | 7.887 |
| 0.8402777777777778 | 7.887 |
| 0.8409722222222222 | 7.887 |
| 0.8416666666666667 | 7.887 |
| 0.842361111111111 | 3.525 |
| 0.8430555555555556 | 3.525 |
| 0.84375 | 3.525 |
| 0.8444444444444444 | 3.525 |
| 0.845138888888889 | 0 |
| 0.8458333333333333 | 0 |
| 0.8465277777777778 | 0 |
| 0.8472222222222222 | 0 |
| 0.8479166666666668 | 0 |
| 0.8486111111111111 | 0 |
| 0.8493055555555555 | 0 |
| 0.85 | 0 |
| 0.8506944444444445 | 0 |
| 0.8513888888888889 | 0 |
| 0.8520833333333333 | 0 |
| 0.8527777777777777 | 0 |
| 0.8534722222222223 | 0 |
| 0.8541666666666666 | 0 |
| 0.8548611111111111 | 0 |
| 0.8555555555555556 | 0 |
| 0.8562500000000001 | 0 |
| 0.8569444444444444 | 0 |
| 0.8576388888888888 | 0 |
| 0.8583333333333334 | 0 |
| 0.8590277777777778 | 0 |
| 0.8597222222222222 | 0 |
| 0.8604166666666666 | 0 |
| 0.8611111111111112 | 0 |
| 0.8618055555555556 | 0 |
| 0.8624999999999999 | 0 |
| 0.8631944444444444 | 0 |
| 0.8638888888888889 | 0 |
| 0.8645833333333334 | 0 |
| 0.8652777777777777 | 0 |
| 0.8659722222222223 | 0 |
| 0.8666666666666667 | 0 |
| 0.8673611111111111 | 0 |
| 0.8680555555555555 | 0 |
| 0.86875 | 0 |
| 0.8694444444444445 | 0 |
| 0.8701388888888889 | 0 |
| 0.8708333333333332 | 0 |
| 0.8715277777777778 | 0 |
| 0.8722222222222222 | 0 |
| 0.8729166666666667 | 0 |
| 0.873611111111111 | 0 |
| 0.8743055555555556 | 0 |
| 0.875 | 0 |
| 0.8756944444444444 | 0 |
| 0.876388888888889 | 0 |
| 0.8770833333333333 | 0 |
| 0.8777777777777778 | 0 |
| 0.8784722222222222 | 0 |
| 0.8791666666666668 | 0 |
| 0.8798611111111111 | 0 |
| 0.8805555555555555 | 0 |
| 0.88125 | 0 |
| 0.8819444444444445 | 0 |
| 0.8826388888888889 | 0 |
| 0.8833333333333333 | 0 |
| 0.8840277777777777 | 0 |
| 0.8847222222222223 | 0 |
| 0.8854166666666666 | 0 |
| 0.8861111111111111 | 0 |
| 0.8868055555555556 | 0 |
| 0.8875000000000001 | 0 |
| 0.8881944444444444 | 0 |
| 0.8888888888888888 | 0 |
| 0.8895833333333334 | 0 |
| 0.8902777777777778 | 0 |
| 0.8909722222222222 | 0 |
| 0.8916666666666666 | 0 |
| 0.8923611111111112 | 0 |
| 0.8930555555555556 | 0 |
| 0.8937499999999999 | 0 |
| 0.8944444444444444 | 0 |
| 0.8951388888888889 | 0 |
| 0.8958333333333334 | 0 |
| 0.8965277777777777 | 0 |
| 0.8972222222222223 | 0 |
| 0.8979166666666667 | 0 |
| 0.8986111111111111 | 0 |
| 0.8993055555555555 | 0 |
| 0.9 | 0 |
| 0.9006944444444445 | 0 |
| 0.9013888888888889 | 0 |
| 0.9020833333333332 | 0 |
| 0.9027777777777778 | 0 |
| 0.9034722222222222 | 0 |
| 0.9041666666666667 | 0 |
| 0.904861111111111 | 0 |
| 0.9055555555555556 | 0 |
| 0.90625 | 0 |
| 0.9069444444444444 | 0 |
| 0.907638888888889 | 0 |
| 0.9083333333333333 | 0 |
| 0.9090277777777778 | 0 |
| 0.9097222222222222 | 0 |
| 0.9104166666666668 | 0 |
| 0.9111111111111111 | 0 |
| 0.9118055555555555 | 0 |
| 0.9125 | 0 |
| 0.9131944444444445 | 0 |
| 0.9138888888888889 | 0 |
| 0.9145833333333333 | 0 |
| 0.9152777777777777 | 0 |
| 0.9159722222222223 | 0 |
| 0.9166666666666666 | 0 |
| 0.9173611111111111 | 0 |
| 0.9180555555555556 | 0 |
| 0.9187500000000001 | 0 |
| 0.9194444444444444 | 0 |
| 0.9201388888888888 | 0 |
| 0.9208333333333334 | 0 |
| 0.9215277777777778 | 0 |
| 0.9222222222222222 | 0 |
| 0.9229166666666666 | 0 |
| 0.9236111111111112 | 0 |
| 0.9243055555555556 | 0 |
| 0.9249999999999999 | 0 |
| 0.9256944444444444 | 0 |
| 0.9263888888888889 | 0 |
| 0.9270833333333334 | 0 |
| 0.9277777777777777 | 0 |
| 0.9284722222222223 | 0 |
| 0.9291666666666667 | 0 |
| 0.9298611111111111 | 0 |
| 0.9305555555555555 | 0 |
| 0.93125 | 0 |
| 0.9319444444444445 | 0 |
| 0.9326388888888889 | 0 |
| 0.9333333333333332 | 0 |
| 0.9340277777777778 | 0 |
| 0.9347222222222222 | 0 |
| 0.9354166666666667 | 0 |
| 0.936111111111111 | 0 |
| 0.9368055555555556 | 0 |
| 0.9375 | 0 |
| 0.9381944444444444 | 0 |
| 0.938888888888889 | 0 |
| 0.9395833333333333 | 0 |
| 0.9402777777777778 | 0 |
| 0.9409722222222222 | 0 |
| 0.9416666666666668 | 0 |
| 0.9423611111111111 | 0 |
| 0.9430555555555555 | 0 |
| 0.94375 | 0 |
| 0.9444444444444445 | 0 |
| 0.9451388888888889 | 0 |
| 0.9458333333333333 | 0 |
| 0.9465277777777777 | 0 |
| 0.9472222222222223 | 0 |
| 0.9479166666666666 | 0 |
| 0.9486111111111111 | 0 |
| 0.9493055555555556 | 0 |
| 0.9500000000000001 | 0 |
| 0.9506944444444444 | 0 |
| 0.9513888888888888 | 0 |
| 0.9520833333333334 | 0 |
| 0.9527777777777778 | 0 |
| 0.9534722222222222 | 0 |
| 0.9541666666666666 | 0 |
| 0.9548611111111112 | 0 |
| 0.9555555555555556 | 0 |
| 0.9562499999999999 | 0 |
| 0.9569444444444444 | 0 |
| 0.9576388888888889 | 0 |
| 0.9583333333333334 | 0 |
| 0.9590277777777777 | 0 |
| 0.9597222222222223 | 0 |
| 0.9604166666666667 | 0 |
| 0.9611111111111111 | 0 |
| 0.9618055555555555 | 0 |
| 0.9625 | 0 |
| 0.9631944444444445 | 0 |
| 0.9638888888888889 | 0 |
| 0.9645833333333332 | 0 |
| 0.9652777777777778 | 0 |
| 0.9659722222222222 | 0 |
| 0.9666666666666667 | 0 |
| 0.967361111111111 | 0 |
| 0.9680555555555556 | 0 |
| 0.96875 | 0 |
| 0.9694444444444444 | 0 |
| 0.970138888888889 | 0 |
| 0.9708333333333333 | 0 |
| 0.9715277777777778 | 0 |
| 0.9722222222222222 | 0 |
| 0.9729166666666668 | 0 |
| 0.9736111111111111 | 0 |
| 0.9743055555555555 | 0 |
| 0.975 | 0 |
| 0.9756944444444445 | 0 |
| 0.9763888888888889 | 0 |
| 0.9770833333333333 | 0 |
| 0.9777777777777777 | 0 |
| 0.9784722222222223 | 0 |
| 0.9791666666666666 | 0 |
| 0.9798611111111111 | 0 |
| 0.9805555555555556 | 0 |
| 0.9812500000000001 | 0 |
| 0.9819444444444444 | 0 |
| 0.9826388888888888 | 0 |
| 0.9833333333333334 | 0 |
| 0.9840277777777778 | 0 |
| 0.9847222222222222 | 0 |
| 0.9854166666666666 | 0 |
| 0.9861111111111112 | 0 |
| 0.9868055555555556 | 0 |
| 0.9874999999999999 | 0 |
| 0.9881944444444444 | 0 |
| 0.9888888888888889 | 0 |
| 0.9895833333333334 | 0 |
| 0.9902777777777777 | 0 |
| 0.9909722222222223 | 0 |
| 0.9916666666666667 | 0 |
| 0.9923611111111111 | 0 |
| 0.9930555555555555 | 0 |
| 0.99375 | 0 |
| 0.9944444444444445 | 0 |
| 0.9951388888888889 | 0 |
| 0.9958333333333332 | 0 |
| 0.9965277777777778 | 0 |
| 0.9972222222222222 | 0 |
| 0.9979166666666667 | 0 |
| 0.998611111111111 | 0 |
| 0.9993055555555556 | 0 |